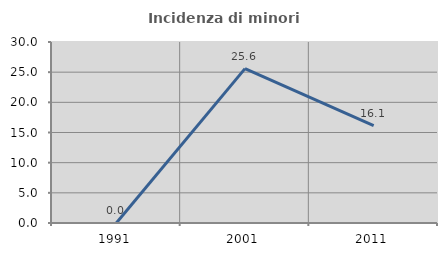
| Category | Incidenza di minori stranieri |
|---|---|
| 1991.0 | 0 |
| 2001.0 | 25.581 |
| 2011.0 | 16.129 |